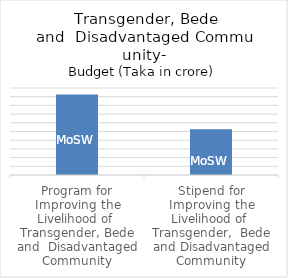
| Category | Budget (Taka in crore) |
|---|---|
| Program for Improving the Livelihood of  Transgender, Bede
and  Disadvantaged Community | 46.31 |
| Stipend for Improving the Livelihood of  Transgender,  Bede
and Disadvantaged Community | 26.35 |